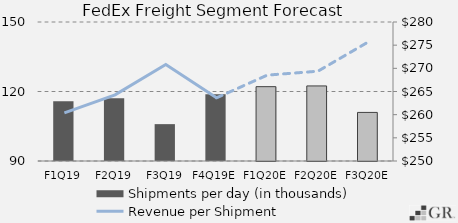
| Category | Shipments per day (in thousands) |
|---|---|
|  F1Q19  | 115.745 |
|  F2Q19  | 117.05 |
|  F3Q19  | 105.912 |
|  F4Q19E  | 118.866 |
|  F1Q20E  | 122.088 |
|  F2Q20E  | 122.402 |
|  F3Q20E  | 110.974 |